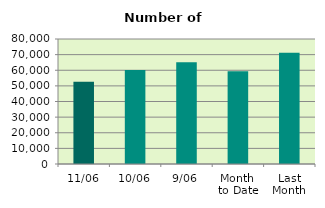
| Category | Series 0 |
|---|---|
| 11/06 | 52602 |
| 10/06 | 60104 |
| 9/06 | 65058 |
| Month 
to Date | 59283.556 |
| Last
Month | 71249.7 |